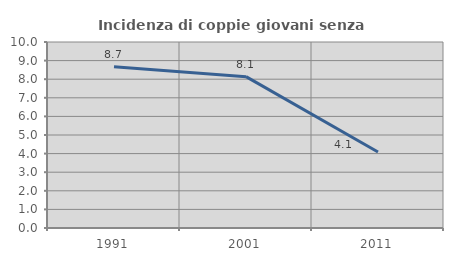
| Category | Incidenza di coppie giovani senza figli |
|---|---|
| 1991.0 | 8.673 |
| 2001.0 | 8.137 |
| 2011.0 | 4.089 |